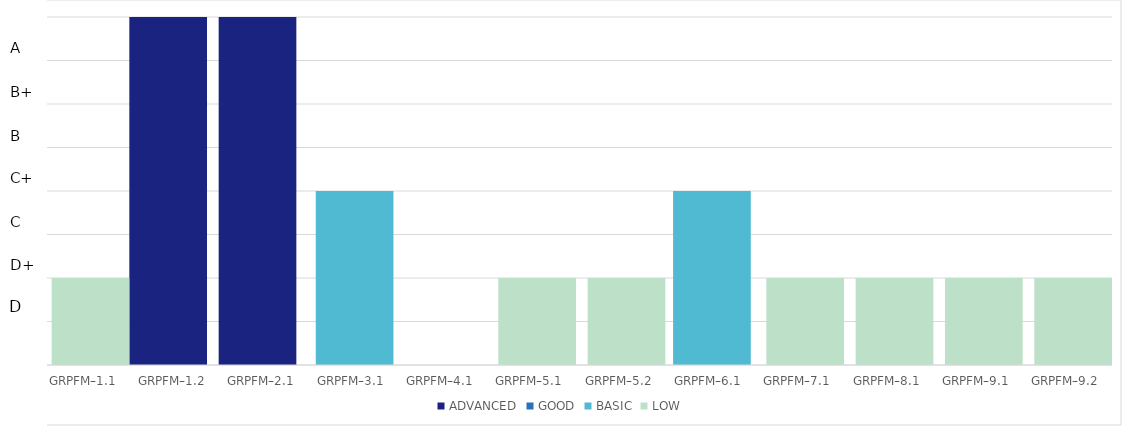
| Category | ADVANCED | GOOD | BASIC | LOW |
|---|---|---|---|---|
| GRPFM–1.1 | 0 | 0 | 0 | 1 |
| GRPFM–1.2 | 4 | 0 | 0 | 0 |
| GRPFM–2.1 | 4 | 0 | 0 | 0 |
| GRPFM–3.1 | 0 | 0 | 2 | 0 |
| GRPFM–4.1 | 0 | 0 | 0 | 0 |
| GRPFM–5.1 | 0 | 0 | 0 | 1 |
| GRPFM–5.2 | 0 | 0 | 0 | 1 |
| GRPFM–6.1 | 0 | 0 | 2 | 0 |
| GRPFM–7.1 | 0 | 0 | 0 | 1 |
| GRPFM–8.1 | 0 | 0 | 0 | 1 |
| GRPFM–9.1 | 0 | 0 | 0 | 1 |
| GRPFM–9.2 | 0 | 0 | 0 | 1 |